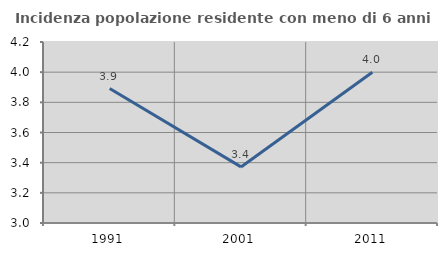
| Category | Incidenza popolazione residente con meno di 6 anni |
|---|---|
| 1991.0 | 3.891 |
| 2001.0 | 3.372 |
| 2011.0 | 4 |